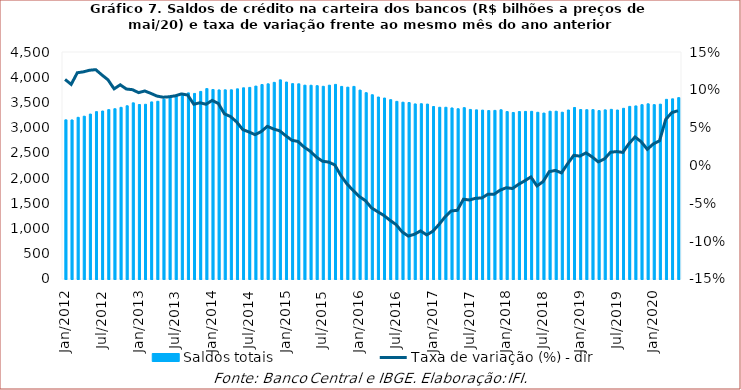
| Category | Saldos totais |
|---|---|
| 2012-01-01 | 3155194.185 |
| 2012-02-01 | 3153196.919 |
| 2012-03-01 | 3204975.003 |
| 2012-04-01 | 3226985.233 |
| 2012-05-01 | 3269561.633 |
| 2012-06-01 | 3317394.399 |
| 2012-07-01 | 3330146.538 |
| 2012-08-01 | 3357351.066 |
| 2012-09-01 | 3375327.804 |
| 2012-10-01 | 3403088.894 |
| 2012-11-01 | 3434141.882 |
| 2012-12-01 | 3491997.84 |
| 2013-01-01 | 3459047.163 |
| 2013-02-01 | 3463748.757 |
| 2013-03-01 | 3510411.084 |
| 2013-04-01 | 3522976.007 |
| 2013-05-01 | 3564661.918 |
| 2013-06-01 | 3618712.367 |
| 2013-07-01 | 3636996.158 |
| 2013-08-01 | 3674972.673 |
| 2013-09-01 | 3689565.205 |
| 2013-10-01 | 3678647.105 |
| 2013-11-01 | 3718781.617 |
| 2013-12-01 | 3774674.089 |
| 2014-01-01 | 3756662.133 |
| 2014-02-01 | 3747944.374 |
| 2014-03-01 | 3750069.482 |
| 2014-04-01 | 3750904.648 |
| 2014-05-01 | 3769660.848 |
| 2014-06-01 | 3790351.637 |
| 2014-07-01 | 3798311.71 |
| 2014-08-01 | 3824746.159 |
| 2014-09-01 | 3854833.596 |
| 2014-10-01 | 3869032.1 |
| 2014-11-01 | 3898387.236 |
| 2014-12-01 | 3947838.143 |
| 2015-01-01 | 3904672.72 |
| 2015-02-01 | 3872978.221 |
| 2015-03-01 | 3869286.378 |
| 2015-04-01 | 3842117.982 |
| 2015-05-01 | 3840808.831 |
| 2015-06-01 | 3832380.879 |
| 2015-07-01 | 3819958.022 |
| 2015-08-01 | 3841983.723 |
| 2015-09-01 | 3857938.718 |
| 2015-10-01 | 3817745.348 |
| 2015-11-01 | 3803223.513 |
| 2015-12-01 | 3817878.549 |
| 2016-01-01 | 3744959.383 |
| 2016-02-01 | 3693235.997 |
| 2016-03-01 | 3652734.519 |
| 2016-04-01 | 3607650.055 |
| 2016-05-01 | 3587652.76 |
| 2016-06-01 | 3555256.958 |
| 2016-07-01 | 3521624.66 |
| 2016-08-01 | 3504889.013 |
| 2016-09-01 | 3498081.192 |
| 2016-10-01 | 3470639.124 |
| 2016-11-01 | 3474508.873 |
| 2016-12-01 | 3467703.201 |
| 2017-01-01 | 3419457.858 |
| 2017-02-01 | 3404811.306 |
| 2017-03-01 | 3404494.13 |
| 2017-04-01 | 3390889.05 |
| 2017-05-01 | 3375115.941 |
| 2017-06-01 | 3396774.162 |
| 2017-07-01 | 3361061.96 |
| 2017-08-01 | 3353269.719 |
| 2017-09-01 | 3347778.755 |
| 2017-10-01 | 3339087.363 |
| 2017-11-01 | 3342609.239 |
| 2017-12-01 | 3354882.289 |
| 2018-01-01 | 3318973.308 |
| 2018-02-01 | 3301235.844 |
| 2018-03-01 | 3319805.121 |
| 2018-04-01 | 3322255.176 |
| 2018-05-01 | 3324027.796 |
| 2018-06-01 | 3305070.774 |
| 2018-07-01 | 3289592.559 |
| 2018-08-01 | 3326024.059 |
| 2018-09-01 | 3326058.271 |
| 2018-10-01 | 3306532.281 |
| 2018-11-01 | 3350301.516 |
| 2018-12-01 | 3400005.43 |
| 2019-01-01 | 3360092.782 |
| 2019-02-01 | 3356372.857 |
| 2019-03-01 | 3357496.235 |
| 2019-04-01 | 3338188.478 |
| 2019-05-01 | 3352797.02 |
| 2019-06-01 | 3363027.343 |
| 2019-07-01 | 3350160.015 |
| 2019-08-01 | 3383787.743 |
| 2019-09-01 | 3421976.744 |
| 2019-10-01 | 3431127.749 |
| 2019-11-01 | 3455585.939 |
| 2019-12-01 | 3472708.398 |
| 2020-01-01 | 3456447.079 |
| 2020-02-01 | 3465909.887 |
| 2020-03-01 | 3561700.124 |
| 2020-04-01 | 3571489.42 |
| 2020-05-01 | 3595553 |